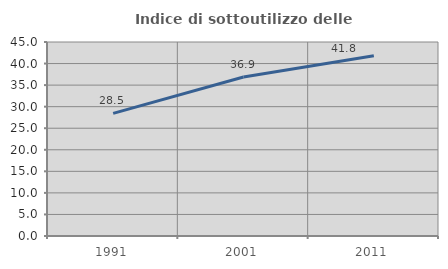
| Category | Indice di sottoutilizzo delle abitazioni  |
|---|---|
| 1991.0 | 28.455 |
| 2001.0 | 36.885 |
| 2011.0 | 41.83 |